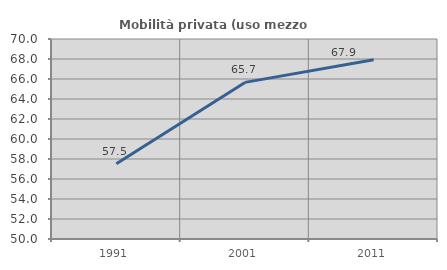
| Category | Mobilità privata (uso mezzo privato) |
|---|---|
| 1991.0 | 57.528 |
| 2001.0 | 65.66 |
| 2011.0 | 67.921 |